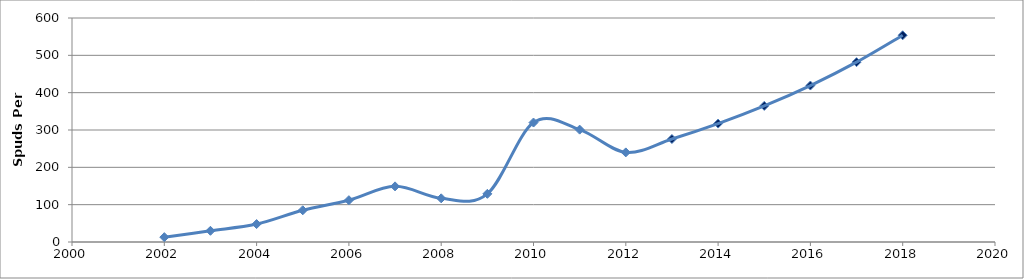
| Category | Series 0 |
|---|---|
| 2002.0 | 13 |
| 2003.0 | 30 |
| 2004.0 | 48 |
| 2005.0 | 85 |
| 2006.0 | 112 |
| 2007.0 | 149 |
| 2008.0 | 117 |
| 2009.0 | 129 |
| 2010.0 | 320 |
| 2011.0 | 301 |
| 2012.0 | 240 |
| 2013.0 | 275.882 |
| 2014.0 | 317.128 |
| 2015.0 | 364.541 |
| 2016.0 | 419.042 |
| 2017.0 | 481.692 |
| 2018.0 | 553.708 |